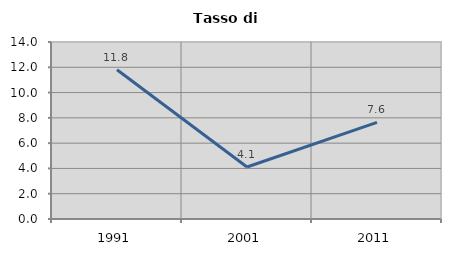
| Category | Tasso di disoccupazione   |
|---|---|
| 1991.0 | 11.803 |
| 2001.0 | 4.115 |
| 2011.0 | 7.638 |